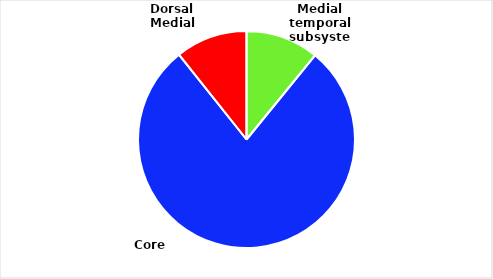
| Category | Series 0 |
|---|---|
| Medial temporal subsystem | 10.869 |
| Core system | 78.434 |
| Dorsal Medial subsystem | 10.697 |